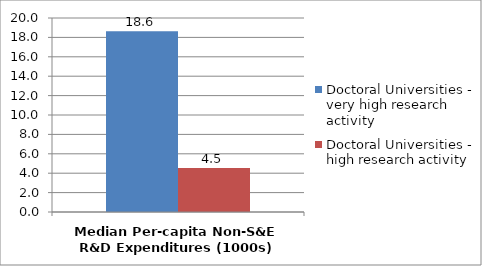
| Category | Doctoral Universities - very high research activity | Doctoral Universities - high research activity |
|---|---|---|
| Median Per-capita Non-S&E R&D Expenditures (1000s) | 18.638 | 4.545 |